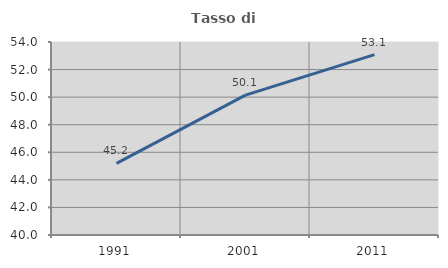
| Category | Tasso di occupazione   |
|---|---|
| 1991.0 | 45.193 |
| 2001.0 | 50.143 |
| 2011.0 | 53.084 |